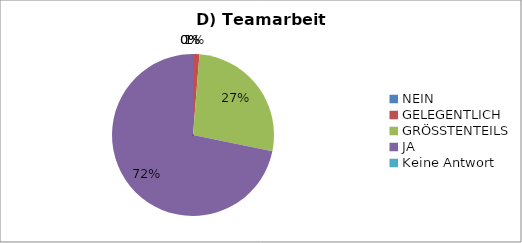
| Category | Series 0 |
|---|---|
| NEIN | 0 |
| GELEGENTLICH | 1 |
| GRÖSSTENTEILS | 21 |
| JA | 56 |
| Keine Antwort | 0 |